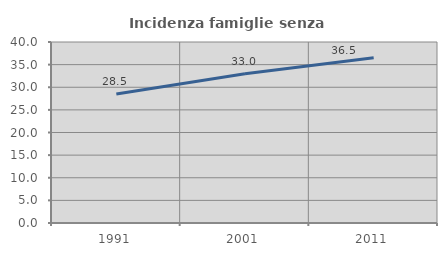
| Category | Incidenza famiglie senza nuclei |
|---|---|
| 1991.0 | 28.519 |
| 2001.0 | 32.983 |
| 2011.0 | 36.508 |